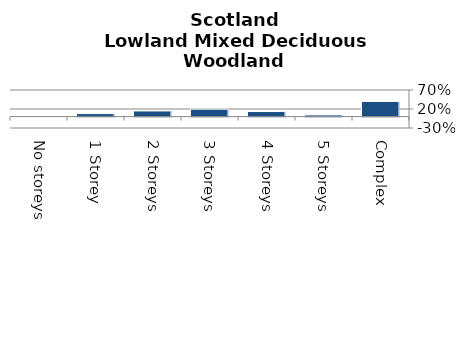
| Category | Lowland Mixed Deciduous Woodland |
|---|---|
| No storeys | 0 |
| 1 Storey | 0.079 |
| 2 Storeys | 0.149 |
| 3 Storeys | 0.196 |
| 4 Storeys | 0.133 |
| 5 Storeys | 0.044 |
| Complex | 0.4 |